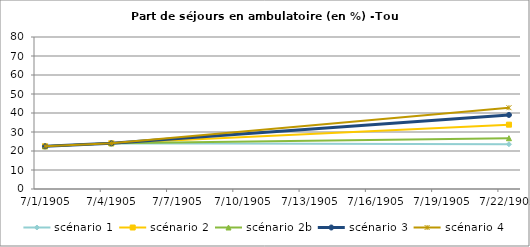
| Category | scénario 1 | scénario 2 | scénario 2b | scénario 3 | scénario 4 |
|---|---|---|---|---|---|
| 2009.0 | 22.479 | 22.479 | 22.479 | 22.479 | 22.479 |
| 2012.0 | 24.04 | 24.04 | 24.04 | 24.04 | 24.04 |
| 2030.0 | 23.554 | 33.862 | 26.729 | 38.979 | 42.786 |